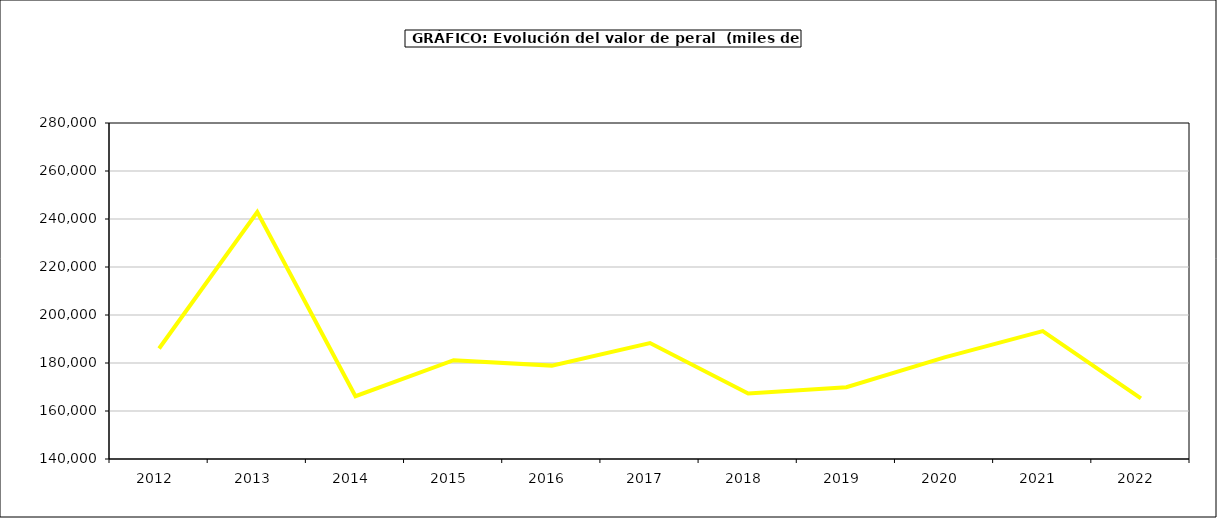
| Category | valor peral |
|---|---|
| 2012.0 | 186031.625 |
| 2013.0 | 242867.092 |
| 2014.0 | 166145.606 |
| 2015.0 | 181166 |
| 2016.0 | 178909 |
| 2017.0 | 188326.979 |
| 2018.0 | 167289.385 |
| 2019.0 | 169898.246 |
| 2020.0 | 182329.972 |
| 2021.0 | 193294.489 |
| 2022.0 | 165280.08 |